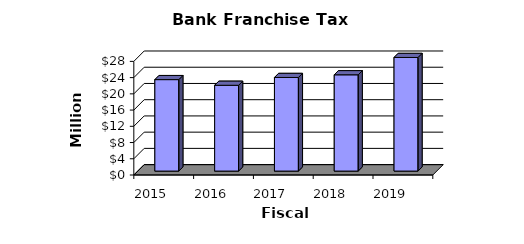
| Category | Series 0 |
|---|---|
| 2015.0 | 22539000 |
| 2016.0 | 21142000 |
| 2017.0 | 23068000 |
| 2018.0 | 23724800 |
| 2019.0 | 29641360 |